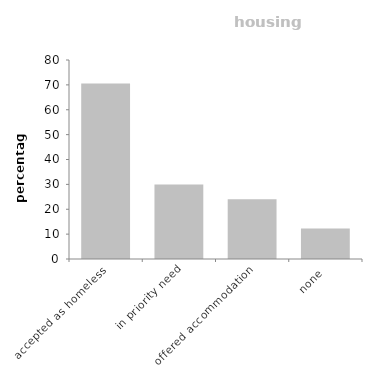
| Category | housing association |
|---|---|
| accepted as homeless | 70.583 |
| in priority need | 29.973 |
| offered accommodation | 24.002 |
| none | 12.227 |